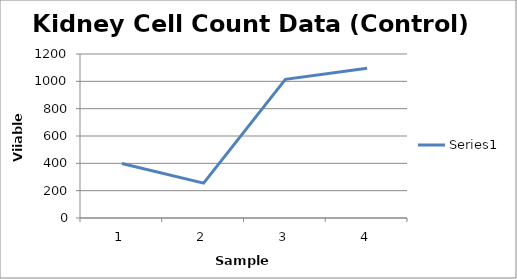
| Category | Series 0 |
|---|---|
| 0 | 399 |
| 1 | 255 |
| 2 | 1015 |
| 3 | 1096 |